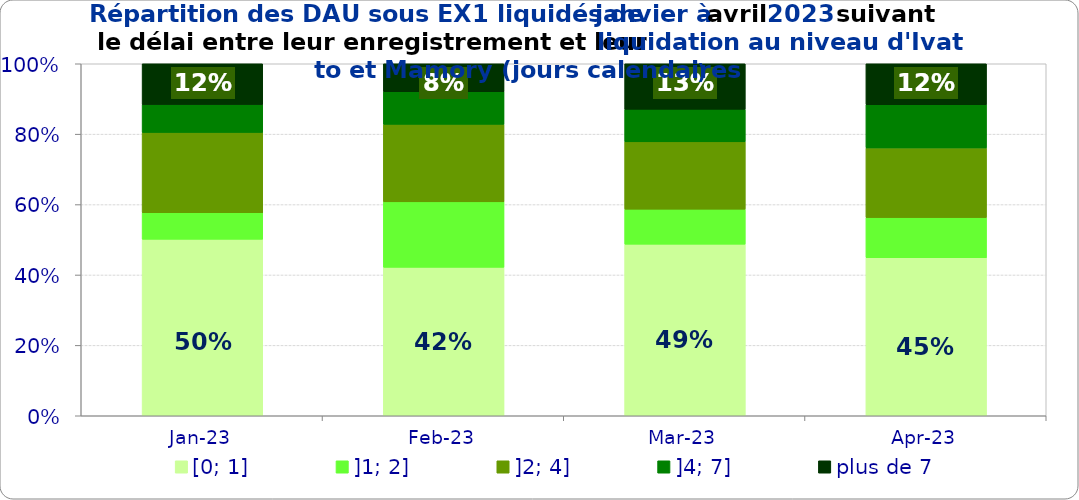
| Category | [0; 1] | ]1; 2] | ]2; 4] | ]4; 7] | plus de 7 |
|---|---|---|---|---|---|
| 2023-01-01 | 0.501 | 0.076 | 0.228 | 0.079 | 0.116 |
| 2023-02-01 | 0.422 | 0.186 | 0.22 | 0.093 | 0.08 |
| 2023-03-01 | 0.487 | 0.1 | 0.191 | 0.092 | 0.129 |
| 2023-04-01 | 0.449 | 0.114 | 0.198 | 0.123 | 0.116 |